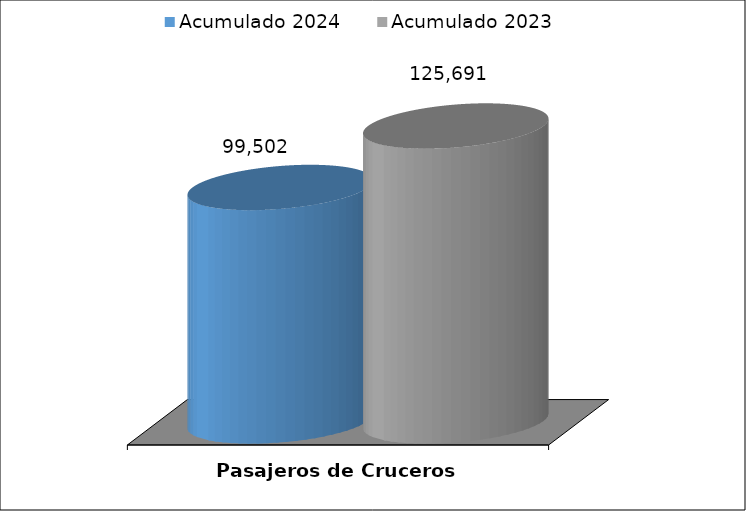
| Category | Acumulado 2024 | Acumulado 2023 |
|---|---|---|
| Pasajeros de Cruceros | 99502 | 125691 |